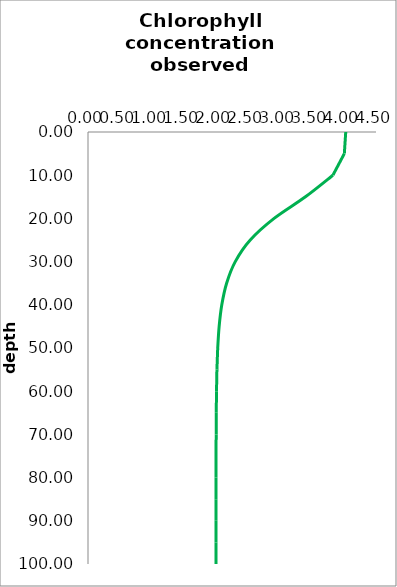
| Category | Profile 2 |
|---|---|
| 4.027141575111103 | 0 |
| 4.005309563990628 | 5 |
| 3.8269185960537855 | 10 |
| 3.3977896528885227 | 15 |
| 2.9079328116421364 | 20 |
| 2.5352169141013277 | 25 |
| 2.3011740570298183 | 30 |
| 2.1659596616384125 | 35 |
| 2.0905758687475156 | 40 |
| 2.0492064309709668 | 45 |
| 2.0266704904135477 | 50 |
| 2.0144385705810235 | 55 |
| 2.007811705889279 | 60 |
| 2.004224963589835 | 65 |
| 2.0022846649997765 | 70 |
| 2.001235322525206 | 75 |
| 2.0006679065297175 | 80 |
| 2.0003611094619616 | 85 |
| 2.0001952340138045 | 90 |
| 2.0001055525064357 | 95 |
| 2.000057066298069 | 100 |